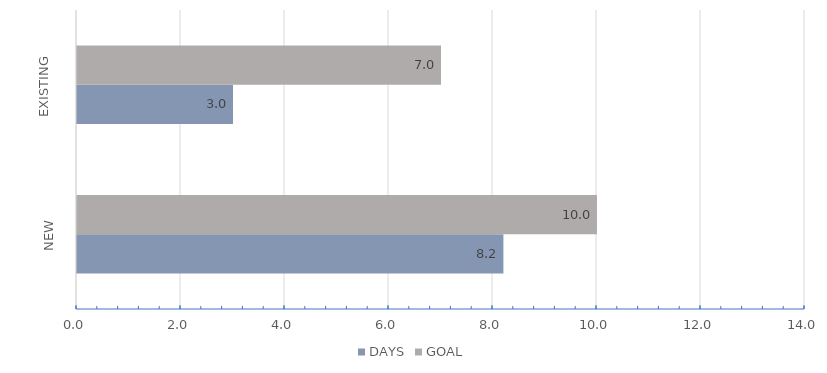
| Category | DAYS | GOAL |
|---|---|---|
| NEW | 8.2 | 10 |
| EXISTING | 3 | 7 |